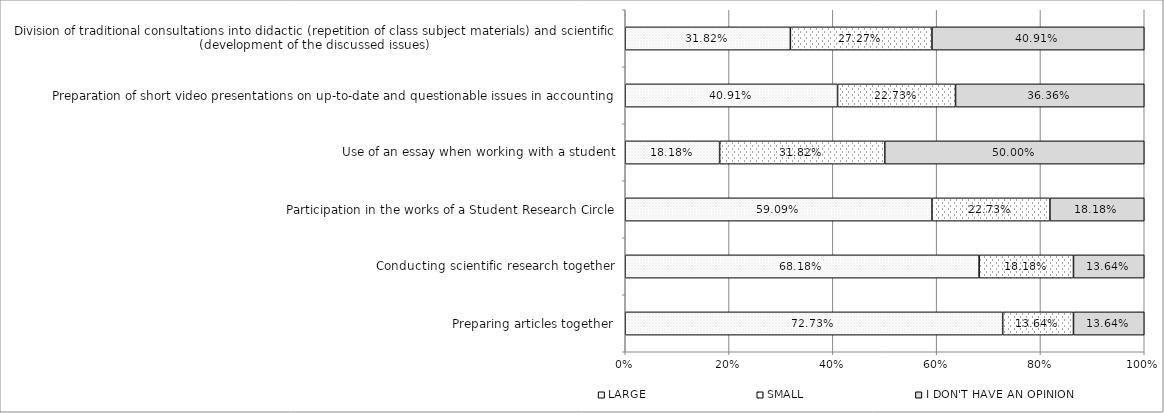
| Category | LARGE | SMALL | I DON'T HAVE AN OPINION |
|---|---|---|---|
| Preparing articles together | 0.727 | 0.136 | 0.136 |
| Conducting scientific research together | 0.682 | 0.182 | 0.136 |
| Participation in the works of a Student Research Circle | 0.591 | 0.227 | 0.182 |
| Use of an essay when working with a student | 0.182 | 0.318 | 0.5 |
| Preparation of short video presentations on up-to-date and questionable issues in accounting | 0.409 | 0.227 | 0.364 |
| Division of traditional consultations into didactic (repetition of class subject materials) and scientific (development of the discussed issues) | 0.318 | 0.273 | 0.409 |